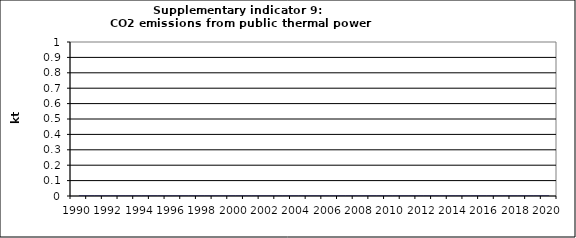
| Category | CO2 emissions from public thermal power stations, kt |
|---|---|
| 1990 | 0 |
| 1991 | 0 |
| 1992 | 0 |
| 1993 | 0 |
| 1994 | 0 |
| 1995 | 0 |
| 1996 | 0 |
| 1997 | 0 |
| 1998 | 0 |
| 1999 | 0 |
| 2000 | 0 |
| 2001 | 0 |
| 2002 | 0 |
| 2003 | 0 |
| 2004 | 0 |
| 2005 | 0 |
| 2006 | 0 |
| 2007 | 0 |
| 2008 | 0 |
| 2009 | 0 |
| 2010 | 0 |
| 2011 | 0 |
| 2012 | 0 |
| 2013 | 0 |
| 2014 | 0 |
| 2015 | 0 |
| 2016 | 0 |
| 2017 | 0 |
| 2018 | 0 |
| 2019 | 0 |
| 2020 | 0 |